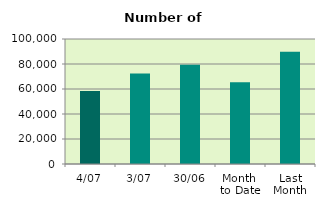
| Category | Series 0 |
|---|---|
| 4/07 | 58478 |
| 3/07 | 72316 |
| 30/06 | 79408 |
| Month 
to Date | 65397 |
| Last
Month | 89884.909 |